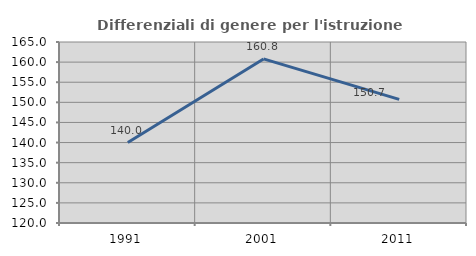
| Category | Differenziali di genere per l'istruzione superiore |
|---|---|
| 1991.0 | 140 |
| 2001.0 | 160.797 |
| 2011.0 | 150.727 |